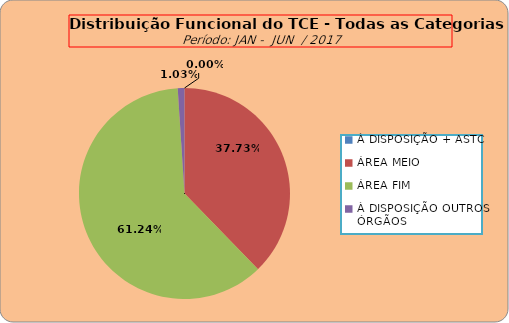
| Category | Series 0 |
|---|---|
| À DISPOSIÇÃO + ASTC | 0 |
| ÁREA MEIO | 183 |
| ÁREA FIM | 297 |
| À DISPOSIÇÃO OUTROS ÓRGÃOS | 5 |